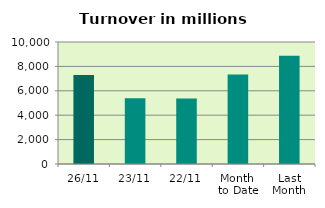
| Category | Series 0 |
|---|---|
| 26/11 | 7291.222 |
| 23/11 | 5382.255 |
| 22/11 | 5370.064 |
| Month 
to Date | 7340.081 |
| Last
Month | 8866.758 |